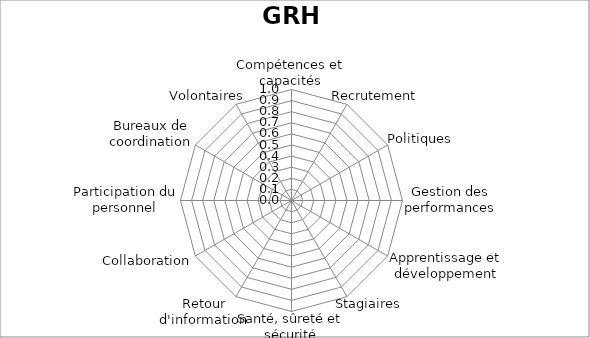
| Category | Compétences et capacités Recrutement Politiques Gestion des performances Apprentissage et développement Stagiaires Santé, sûreté et sécurité Retour d'information Collaboration Participation du personnel Bureaux de coordination Volontaires |
|---|---|
| Compétences et capacités | 0 |
| Recrutement | 0 |
| Politiques | 0 |
| Gestion des performances | 0 |
| Apprentissage et développement | 0 |
| Stagiaires | 0 |
| Santé, sûreté et sécurité | 0 |
| Retour d'information | 0 |
| Collaboration | 0 |
| Participation du personnel | 0 |
| Bureaux de coordination | 0 |
| Volontaires | 0 |